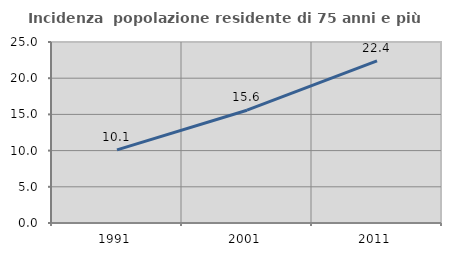
| Category | Incidenza  popolazione residente di 75 anni e più |
|---|---|
| 1991.0 | 10.098 |
| 2001.0 | 15.58 |
| 2011.0 | 22.39 |